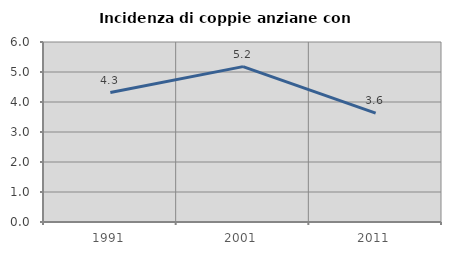
| Category | Incidenza di coppie anziane con figli |
|---|---|
| 1991.0 | 4.317 |
| 2001.0 | 5.179 |
| 2011.0 | 3.629 |